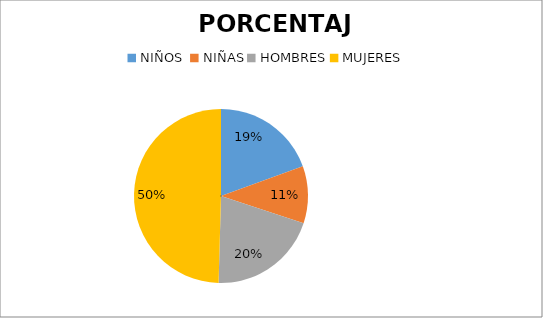
| Category | PORCENTAJE | CANTIDAD |
|---|---|---|
| NIÑOS  | 19.469 | 22 |
| NIÑAS | 10.619 | 12 |
| HOMBRES | 20.354 | 23 |
| MUJERES | 49.558 | 56 |